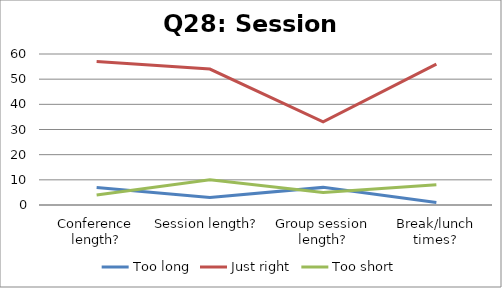
| Category | Too long | Just right | Too short |
|---|---|---|---|
| Conference length? | 7 | 57 | 4 |
| Session length? | 3 | 54 | 10 |
| Group session length? | 7 | 33 | 5 |
| Break/lunch times? | 1 | 56 | 8 |